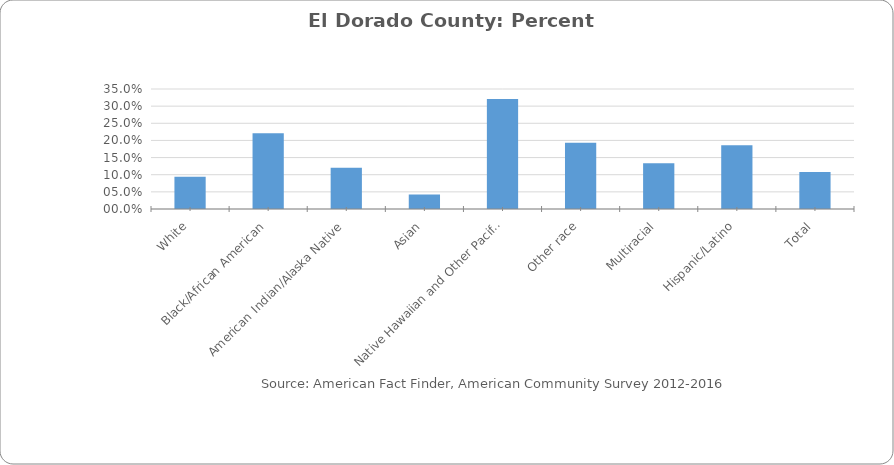
| Category | Percent Population below Poverty Level in El Dorado County |
|---|---|
| White | 0.094 |
| Black/African American | 0.221 |
| American Indian/Alaska Native | 0.12 |
| Asian | 0.042 |
|  Native Hawaiian and Other Pacific Islander | 0.321 |
| Other race | 0.193 |
| Multiracial | 0.133 |
| Hispanic/Latino | 0.186 |
| Total | 0.108 |